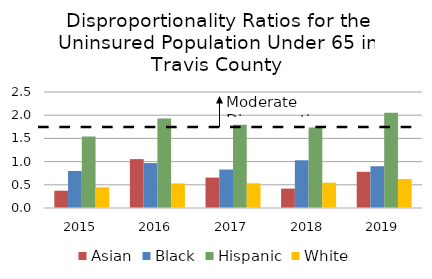
| Category | Asian | Black | Hispanic | White |
|---|---|---|---|---|
| 2015.0 | 0.372 | 0.798 | 1.542 | 0.447 |
| 2016.0 | 1.054 | 0.968 | 1.926 | 0.529 |
| 2017.0 | 0.655 | 0.829 | 1.793 | 0.533 |
| 2018.0 | 0.418 | 1.029 | 1.734 | 0.546 |
| 2019.0 | 0.781 | 0.9 | 2.052 | 0.624 |